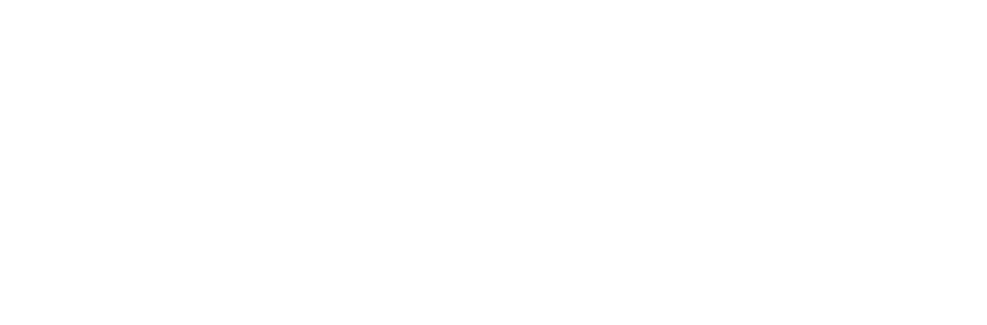
| Category | Total |
|---|---|
| 0 | 0.108 |
| 1 | 0.222 |
| 2 | 0.421 |
| 3 | 0.204 |
| 4 | 0.046 |